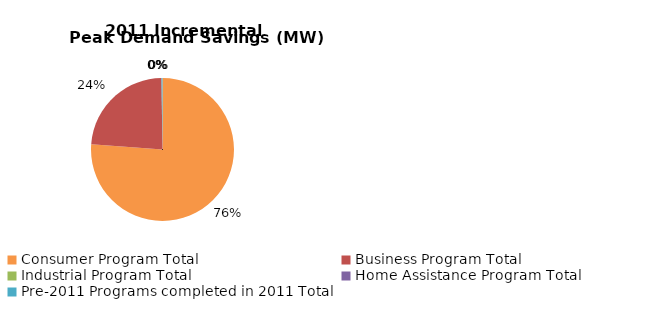
| Category | Incremental Peak Demand Savings (kW) |
|---|---|
| Consumer Program Total | 11.385 |
| Business Program Total | 3.524 |
| Industrial Program Total | 0 |
| Home Assistance Program Total | 0 |
| Pre-2011 Programs completed in 2011 Total | 0.035 |